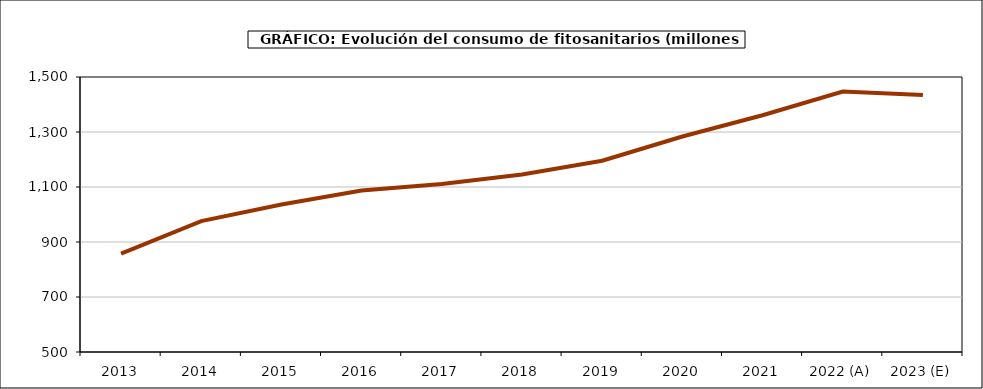
| Category | fitosanitarios |
|---|---|
| 2013 | 857.443 |
| 2014 | 975.802 |
| 2015 | 1036.274 |
| 2016 | 1086.927 |
| 2017 | 1110.713 |
| 2018 | 1145.257 |
| 2019 | 1195.414 |
| 2020 | 1283.655 |
| 2021 | 1361.047 |
| 2022 (A) | 1447.303 |
| 2023 (E) | 1434.107 |